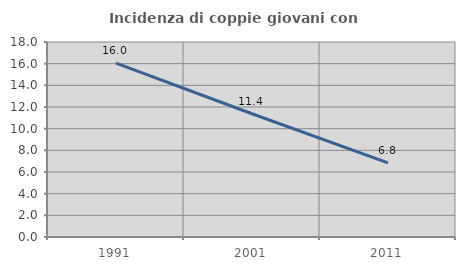
| Category | Incidenza di coppie giovani con figli |
|---|---|
| 1991.0 | 16.043 |
| 2001.0 | 11.379 |
| 2011.0 | 6.836 |